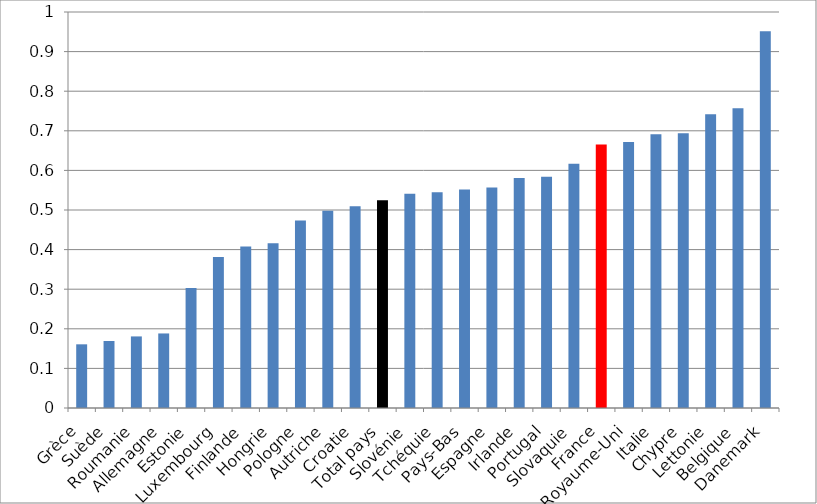
| Category | part case diagonale |
|---|---|
| Grèce | 0.161 |
| Suède | 0.169 |
| Roumanie | 0.181 |
| Allemagne | 0.188 |
| Estonie | 0.303 |
| Luxembourg | 0.381 |
| Finlande | 0.408 |
| Hongrie | 0.416 |
| Pologne | 0.474 |
| Autriche | 0.498 |
| Croatie | 0.51 |
| Total pays | 0.524 |
| Slovénie | 0.541 |
| Tchéquie | 0.545 |
| Pays-Bas | 0.552 |
| Espagne | 0.557 |
| Irlande | 0.581 |
| Portugal | 0.584 |
| Slovaquie | 0.617 |
| France | 0.666 |
| Royaume-Uni | 0.672 |
| Italie | 0.691 |
| Chypre | 0.694 |
| Lettonie | 0.742 |
| Belgique | 0.757 |
| Danemark | 0.951 |